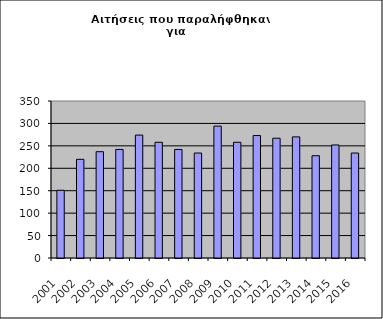
| Category | Series 1 |
|---|---|
| 2001.0 | 151 |
| 2002.0 | 220 |
| 2003.0 | 237 |
| 2004.0 | 242 |
| 2005.0 | 274 |
| 2006.0 | 258 |
| 2007.0 | 242 |
| 2008.0 | 234 |
| 2009.0 | 294 |
| 2010.0 | 258 |
| 2011.0 | 273 |
| 2012.0 | 267 |
| 2013.0 | 270 |
| 2014.0 | 228 |
| 2015.0 | 252 |
| 2016.0 | 234 |